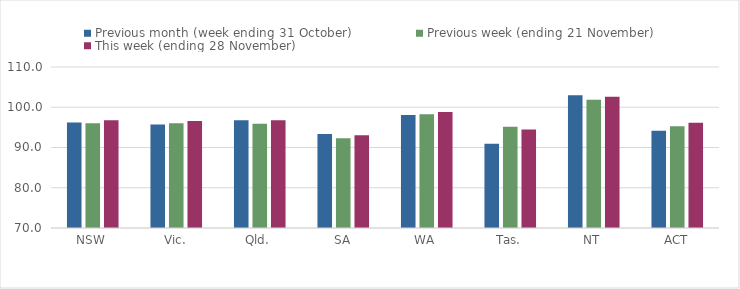
| Category | Previous month (week ending 31 October) | Previous week (ending 21 November) | This week (ending 28 November) |
|---|---|---|---|
| NSW | 96.2 | 96.02 | 96.74 |
| Vic. | 95.69 | 96.04 | 96.61 |
| Qld. | 96.75 | 95.92 | 96.79 |
| SA | 93.36 | 92.3 | 93.07 |
| WA | 98.05 | 98.28 | 98.81 |
| Tas. | 90.93 | 95.13 | 94.48 |
| NT | 103 | 101.86 | 102.58 |
| ACT | 94.15 | 95.28 | 96.12 |